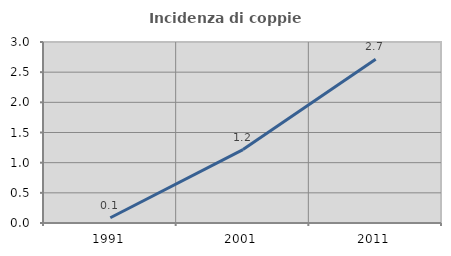
| Category | Incidenza di coppie miste |
|---|---|
| 1991.0 | 0.087 |
| 2001.0 | 1.217 |
| 2011.0 | 2.716 |